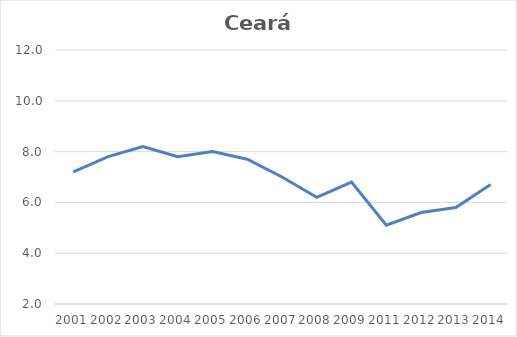
| Category | Total |
|---|---|
| 2001.0 | 7.2 |
| 2002.0 | 7.8 |
| 2003.0 | 8.2 |
| 2004.0 | 7.8 |
| 2005.0 | 8 |
| 2006.0 | 7.7 |
| 2007.0 | 7 |
| 2008.0 | 6.2 |
| 2009.0 | 6.8 |
| 2011.0 | 5.1 |
| 2012.0 | 5.6 |
| 2013.0 | 5.8 |
| 2014.0 | 6.7 |